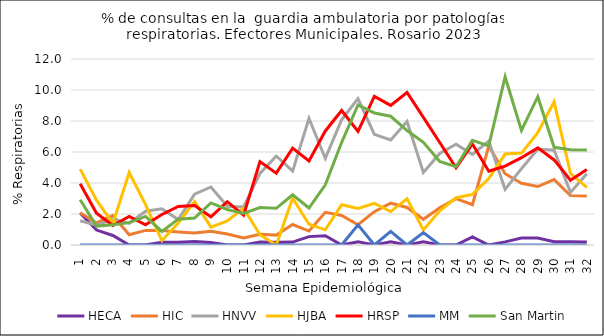
| Category | HECA | HIC | HNVV | HJBA | HRSP | MM | San Martin |
|---|---|---|---|---|---|---|---|
| 1.0 | 2.06 | 2.075 | 1.561 | 4.898 | 3.954 | 0 | 2.924 |
| 2.0 | 0.963 | 1.422 | 1.279 | 2.888 | 2.052 | 0 | 1.22 |
| 3.0 | 0.613 | 1.903 | 1.668 | 1.389 | 1.259 | 0 | 1.312 |
| 4.0 | 0 | 0.664 | 1.398 | 4.681 | 1.848 | 0 | 1.444 |
| 5.0 | 0 | 0.94 | 2.178 | 2.609 | 1.306 | 0 | 1.845 |
| 6.0 | 0.183 | 0.936 | 2.336 | 0.28 | 1.966 | 0 | 0.875 |
| 7.0 | 0.185 | 0.843 | 1.639 | 1.425 | 2.491 | 0 | 1.667 |
| 8.0 | 0.225 | 0.77 | 3.282 | 2.795 | 2.541 | 0 | 1.736 |
| 9.0 | 0.168 | 0.889 | 3.745 | 1.149 | 1.817 | 0 | 2.717 |
| 10.0 | 0 | 0.714 | 2.495 | 1.548 | 2.797 | 0 | 2.291 |
| 11.0 | 0 | 0.457 | 2.455 | 2.375 | 1.918 | 0 | 2.041 |
| 12.0 | 0.193 | 0.698 | 4.617 | 0.662 | 5.383 | 0 | 2.42 |
| 13.0 | 0.177 | 0.638 | 5.741 | 0 | 4.637 | 0 | 2.366 |
| 14.0 | 0.186 | 1.32 | 4.769 | 3.021 | 6.246 | 0 | 3.243 |
| 15.0 | 0.541 | 0.902 | 8.17 | 1.34 | 5.425 | 0 | 2.388 |
| 16.0 | 0.594 | 2.109 | 5.584 | 0.98 | 7.358 | 0 | 3.883 |
| 17.0 | 0 | 1.908 | 8.092 | 2.594 | 8.675 | 0 | 6.624 |
| 18.0 | 0.211 | 1.304 | 9.449 | 2.364 | 7.329 | 1.304 | 9.032 |
| 19.0 | 0 | 2.151 | 7.137 | 2.689 | 9.586 | 0 | 8.519 |
| 20.0 | 0.211 | 2.698 | 6.775 | 2.156 | 9.005 | 0.873 | 8.306 |
| 21.0 | 0 | 2.421 | 7.965 | 2.978 | 9.841 | 0 | 7.383 |
| 22.0 | 0.202 | 1.658 | 4.673 | 0.976 | 8.238 | 0.8 | 6.629 |
| 23.0 | 0 | 2.395 | 5.906 | 2.2 | 6.614 | 0 | 5.386 |
| 24.0 | 0 | 2.994 | 6.504 | 3.051 | 4.987 | 0 | 5.053 |
| 25.0 | 0.528 | 2.6 | 5.839 | 3.264 | 6.517 | 0 | 6.748 |
| 26.0 | 0 | 6.383 | 6.706 | 4.282 | 4.755 | 0 | 6.392 |
| 27.0 | 0.201 | 4.596 | 3.586 | 5.868 | 5.093 | 0 | 10.85 |
| 28.0 | 0.448 | 3.978 | 4.923 | 5.93 | 5.633 | 0 | 7.398 |
| 29.0 | 0.444 | 3.77 | 6.198 | 7.254 | 6.265 | 0 | 9.569 |
| 30.0 | 0.212 | 4.218 | 6.12 | 9.238 | 5.489 | 0 | 6.301 |
| 31.0 | 0.204 | 3.191 | 3.395 | 4.612 | 4.173 | 0 | 6.15 |
| 32.0 | 0.198 | 3.156 | 4.59 | 3.714 | 4.876 | 0 | 6.127 |